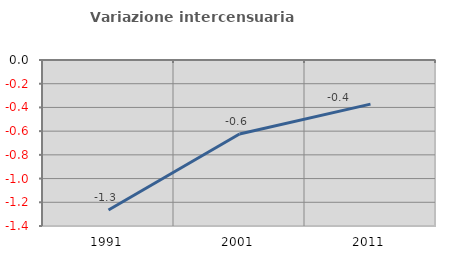
| Category | Variazione intercensuaria annua |
|---|---|
| 1991.0 | -1.265 |
| 2001.0 | -0.624 |
| 2011.0 | -0.372 |